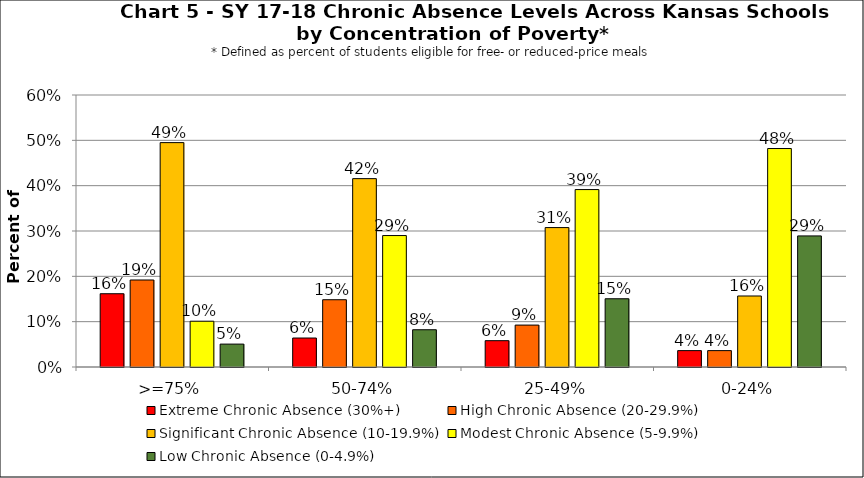
| Category | Extreme Chronic Absence (30%+) | High Chronic Absence (20-29.9%) | Significant Chronic Absence (10-19.9%) | Modest Chronic Absence (5-9.9%) | Low Chronic Absence (0-4.9%) |
|---|---|---|---|---|---|
| 0 | 0.162 | 0.192 | 0.495 | 0.101 | 0.051 |
| 1 | 0.064 | 0.148 | 0.416 | 0.29 | 0.082 |
| 2 | 0.058 | 0.092 | 0.308 | 0.391 | 0.151 |
| 3 | 0.036 | 0.036 | 0.157 | 0.482 | 0.289 |